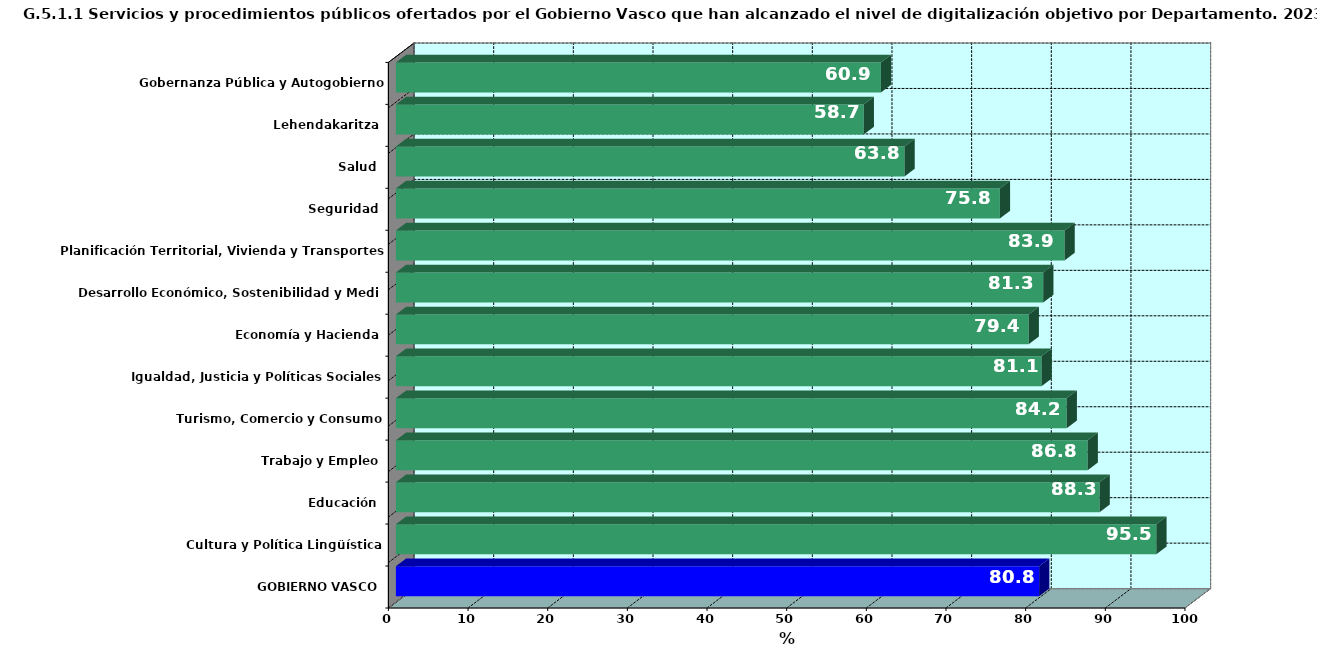
| Category | Series 0 |
|---|---|
| GOBIERNO VASCO | 80.751 |
| Cultura y Política Lingüística | 95.465 |
| Educación | 88.339 |
| Trabajo y Empleo | 86.842 |
| Turismo, Comercio y Consumo | 84.211 |
| Igualdad, Justicia y Políticas Sociales | 81.053 |
| Economía y Hacienda | 79.439 |
| Desarrollo Económico, Sostenibilidad y Medio Ambiente | 81.263 |
| Planificación Territorial, Vivienda y Transportes | 83.938 |
| Seguridad | 75.82 |
| Salud | 63.85 |
| Lehendakaritza | 58.73 |
| Gobernanza Pública y Autogobierno | 60.891 |